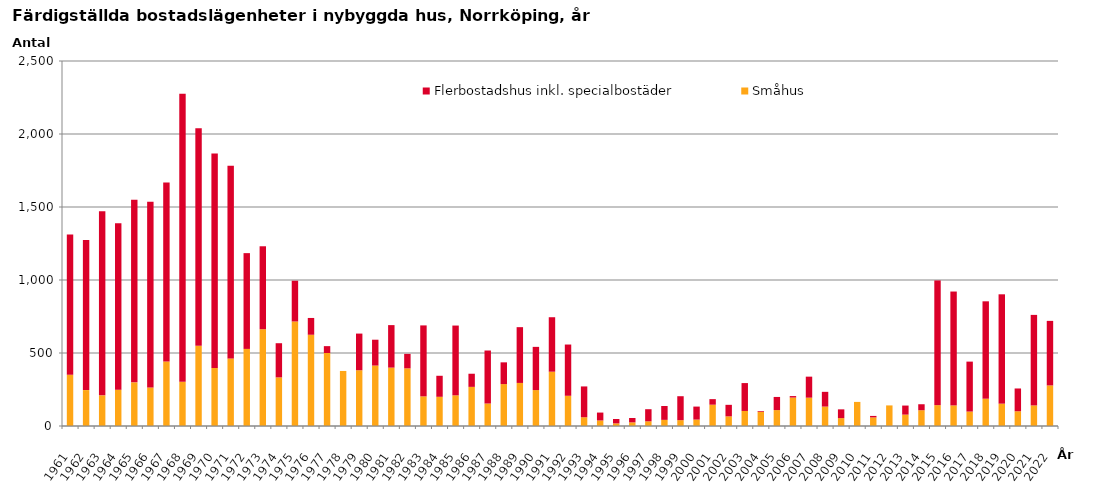
| Category | Småhus | Flerbostadshus inkl. specialbostäder |
|---|---|---|
| 1961.0 | 351 | 960 |
| 1962.0 | 246 | 1028 |
| 1963.0 | 210 | 1261 |
| 1964.0 | 249 | 1139 |
| 1965.0 | 299 | 1250 |
| 1966.0 | 264 | 1272 |
| 1967.0 | 442 | 1225 |
| 1968.0 | 303 | 1972 |
| 1969.0 | 549 | 1490 |
| 1970.0 | 398 | 1469 |
| 1971.0 | 463 | 1320 |
| 1972.0 | 528 | 656 |
| 1973.0 | 663 | 568 |
| 1974.0 | 333 | 234 |
| 1975.0 | 716 | 279 |
| 1976.0 | 625 | 115 |
| 1977.0 | 500 | 47 |
| 1978.0 | 377 | 0 |
| 1979.0 | 382 | 251 |
| 1980.0 | 414 | 177 |
| 1981.0 | 400 | 291 |
| 1982.0 | 395 | 99 |
| 1983.0 | 203 | 486 |
| 1984.0 | 200 | 144 |
| 1985.0 | 210 | 478 |
| 1986.0 | 268 | 90 |
| 1987.0 | 154 | 363 |
| 1988.0 | 287 | 149 |
| 1989.0 | 295 | 382 |
| 1990.0 | 246 | 296 |
| 1991.0 | 372 | 373 |
| 1992.0 | 207 | 351 |
| 1993.0 | 60 | 211 |
| 1994.0 | 38 | 54 |
| 1995.0 | 18 | 30 |
| 1996.0 | 25 | 30 |
| 1997.0 | 32 | 83 |
| 1998.0 | 42 | 95 |
| 1999.0 | 40 | 164 |
| 2000.0 | 44 | 89 |
| 2001.0 | 146 | 38 |
| 2002.0 | 66 | 79 |
| 2003.0 | 103 | 191 |
| 2004.0 | 97 | 5 |
| 2005.0 | 109 | 90 |
| 2006.0 | 195 | 10 |
| 2007.0 | 194 | 144 |
| 2008.0 | 133 | 101 |
| 2009.0 | 54 | 60 |
| 2010.0 | 165 | 0 |
| 2011.0 | 59 | 10 |
| 2012.0 | 141 | 0 |
| 2013.0 | 78 | 62 |
| 2014.0 | 108 | 41 |
| 2015.0 | 143 | 854 |
| 2016.0 | 141 | 780 |
| 2017.0 | 99 | 342 |
| 2018.0 | 187 | 667 |
| 2019.0 | 153 | 749 |
| 2020.0 | 101 | 156 |
| 2021.0 | 141 | 620 |
| 2022.0 | 278 | 442 |